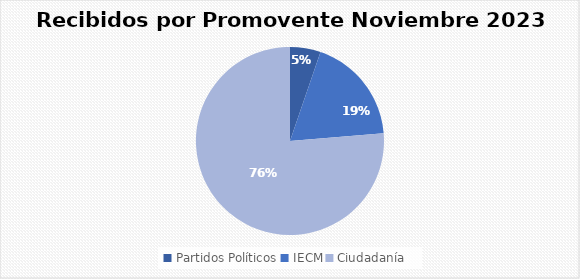
| Category | Recibidos por Promovente NOVIEMBRE |
|---|---|
| Partidos Políticos | 2 |
| IECM | 7 |
| Ciudadanía  | 29 |